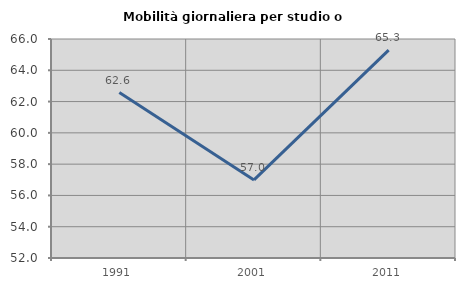
| Category | Mobilità giornaliera per studio o lavoro |
|---|---|
| 1991.0 | 62.574 |
| 2001.0 | 56.992 |
| 2011.0 | 65.291 |